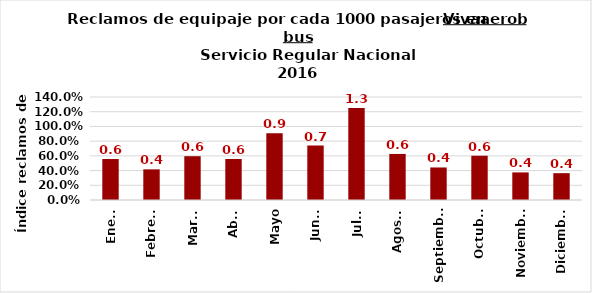
| Category | Reclamos por cada 1000 pasajeros |
|---|---|
| Enero | 0.558 |
| Febrero | 0.417 |
| Marzo | 0.595 |
| Abril | 0.557 |
| Mayo | 0.909 |
| Junio | 0.739 |
| Julio | 1.251 |
| Agosto | 0.626 |
| Septiembre | 0.442 |
| Octubre | 0.601 |
| Noviembre | 0.375 |
| Diciembre | 0.365 |